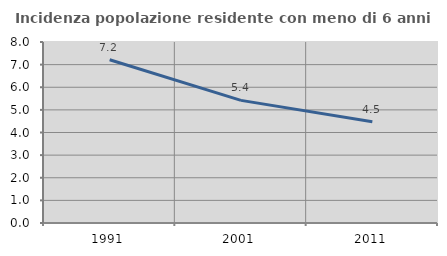
| Category | Incidenza popolazione residente con meno di 6 anni |
|---|---|
| 1991.0 | 7.216 |
| 2001.0 | 5.42 |
| 2011.0 | 4.478 |